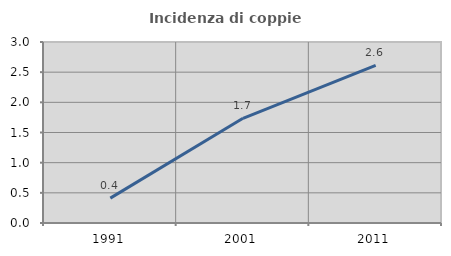
| Category | Incidenza di coppie miste |
|---|---|
| 1991.0 | 0.413 |
| 2001.0 | 1.735 |
| 2011.0 | 2.612 |